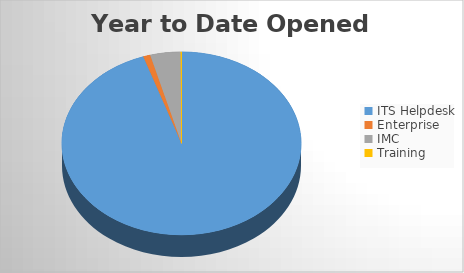
| Category | YTD Opened Tickets | 6M Opened |
|---|---|---|
| ITS Helpdesk | 3058 | 2209 |
| Enterprise | 31 | 27 |
| IMC | 132 | 103 |
| Training | 4 | 4 |